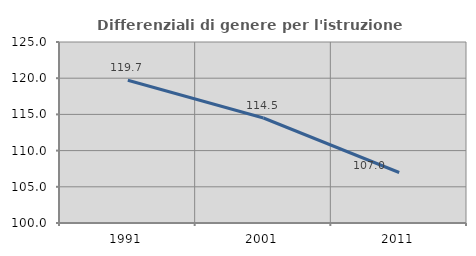
| Category | Differenziali di genere per l'istruzione superiore |
|---|---|
| 1991.0 | 119.709 |
| 2001.0 | 114.501 |
| 2011.0 | 106.977 |